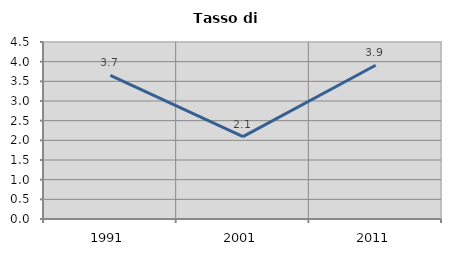
| Category | Tasso di disoccupazione   |
|---|---|
| 1991.0 | 3.651 |
| 2001.0 | 2.093 |
| 2011.0 | 3.909 |